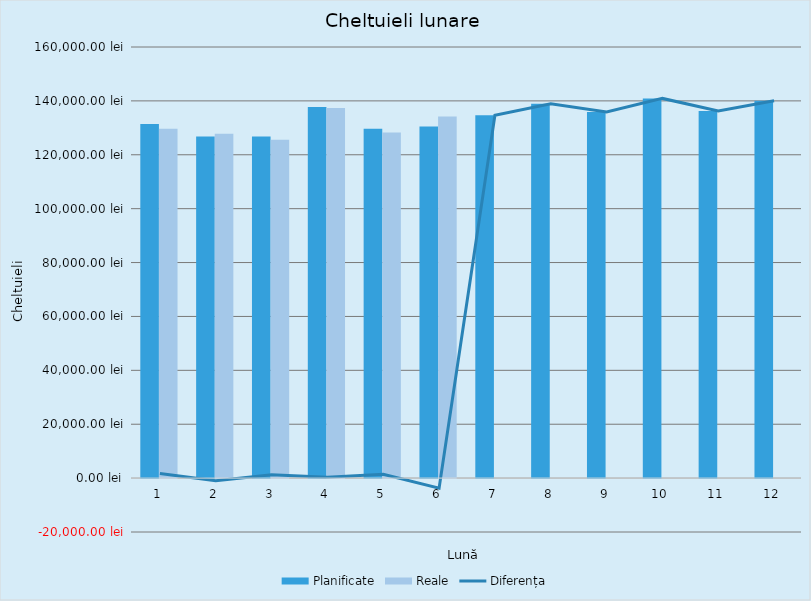
| Category | Planificate | Reale |
|---|---|---|
| 0 | 131420 | 129682 |
| 1 | 126820 | 127804 |
| 2 | 126820 | 125565 |
| 3 | 137695 | 137394 |
| 4 | 129695 | 128255 |
| 5 | 130495 | 134239 |
| 6 | 134695 | 0 |
| 7 | 138918 | 0 |
| 8 | 135918 | 0 |
| 9 | 140918 | 0 |
| 10 | 136218 | 0 |
| 11 | 140018 | 0 |